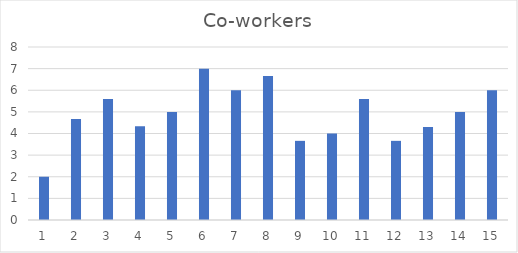
| Category | Co-workers |
|---|---|
| 0 | 2 |
| 1 | 4.67 |
| 2 | 5.6 |
| 3 | 4.33 |
| 4 | 5 |
| 5 | 7 |
| 6 | 6 |
| 7 | 6.66 |
| 8 | 3.66 |
| 9 | 4 |
| 10 | 5.6 |
| 11 | 3.66 |
| 12 | 4.3 |
| 13 | 5 |
| 14 | 6 |